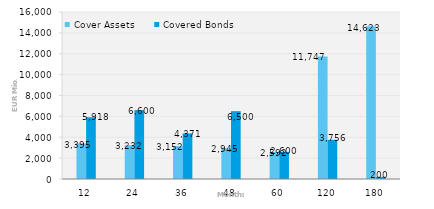
| Category | Cover Assets | Covered Bonds |
|---|---|---|
| 12.0 | 3395.305 | 5917.593 |
| 24.0 | 3231.649 | 6600 |
| 36.0 | 3152.482 | 4371.282 |
| 48.0 | 2944.541 | 6500 |
| 60.0 | 2592.282 | 2600 |
| 120.0 | 11746.931 | 3756.296 |
| 180.0 | 14622.81 | 200 |